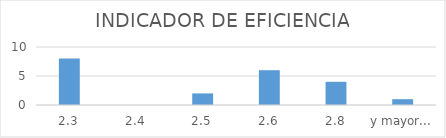
| Category | Frecuencia |
|---|---|
| 2.3 | 8 |
| 2.4 | 0 |
| 2.5 | 2 |
| 2.6 | 6 |
| 2.8 | 4 |
| y mayor... | 1 |